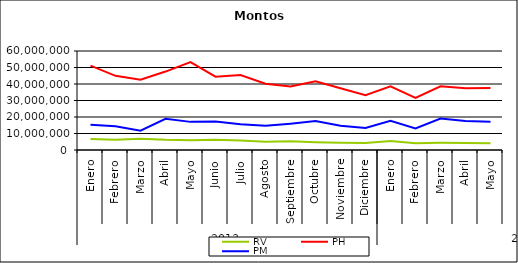
| Category | RV | PH | PM |
|---|---|---|---|
| 0 | 6603412.357 | 51097257.501 | 15291994.497 |
| 1 | 6144371.716 | 44938482.89 | 14418861.164 |
| 2 | 6870539.137 | 42574717.992 | 11735480.075 |
| 3 | 6139858.354 | 47535968.024 | 18924825.739 |
| 4 | 5890476.617 | 53273527.932 | 17047621.863 |
| 5 | 6142686.449 | 44450017.2 | 17254269.094 |
| 6 | 5792277.798 | 45481930.674 | 15546714.502 |
| 7 | 4962192.427 | 40196203.529 | 14644148.591 |
| 8 | 5244267.415 | 38549056.812 | 15946518.356 |
| 9 | 4723321.466 | 41614732.22 | 17536811.707 |
| 10 | 4437368.656 | 37439358.84 | 14761398.421 |
| 11 | 4226608.984 | 33178083.97 | 13384599.022 |
| 12 | 5420667.417 | 38592535.269 | 17738595.757 |
| 13 | 4106438.771 | 31549668.118 | 13082413.394 |
| 14 | 4333641.03 | 38643419.598 | 19107804.717 |
| 15 | 4275572.01 | 37358737.373 | 17555594.298 |
| 16 | 4139390.073 | 37637742.383 | 17146834.395 |